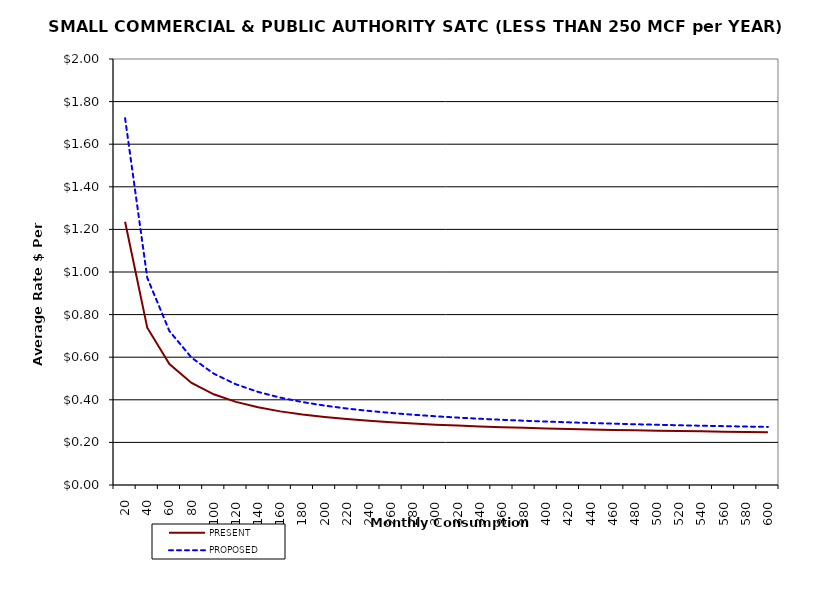
| Category | PRESENT | PROPOSED |
|---|---|---|
| 20.0 | 1.236 | 1.723 |
| 40.0 | 0.739 | 0.973 |
| 60.0 | 0.568 | 0.723 |
| 80.0 | 0.479 | 0.598 |
| 100.0 | 0.426 | 0.523 |
| 120.0 | 0.39 | 0.473 |
| 140.0 | 0.365 | 0.437 |
| 160.0 | 0.346 | 0.41 |
| 180.0 | 0.331 | 0.389 |
| 200.0 | 0.319 | 0.373 |
| 220.0 | 0.309 | 0.359 |
| 240.0 | 0.301 | 0.348 |
| 260.0 | 0.294 | 0.338 |
| 280.0 | 0.288 | 0.33 |
| 300.0 | 0.283 | 0.323 |
| 320.0 | 0.279 | 0.316 |
| 340.0 | 0.275 | 0.311 |
| 360.0 | 0.272 | 0.306 |
| 380.0 | 0.268 | 0.302 |
| 400.0 | 0.266 | 0.298 |
| 420.0 | 0.263 | 0.294 |
| 440.0 | 0.261 | 0.291 |
| 460.0 | 0.259 | 0.288 |
| 480.0 | 0.257 | 0.285 |
| 500.0 | 0.255 | 0.283 |
| 520.0 | 0.253 | 0.28 |
| 540.0 | 0.252 | 0.278 |
| 560.0 | 0.25 | 0.276 |
| 580.0 | 0.249 | 0.274 |
| 600.0 | 0.248 | 0.273 |